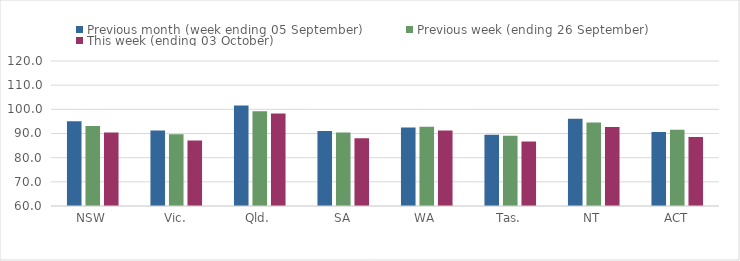
| Category | Previous month (week ending 05 September) | Previous week (ending 26 September) | This week (ending 03 October) |
|---|---|---|---|
| NSW | 95.12 | 93.07 | 90.46 |
| Vic. | 91.21 | 89.71 | 87.12 |
| Qld. | 101.62 | 99.2 | 98.28 |
| SA | 91.05 | 90.4 | 88.05 |
| WA | 92.48 | 92.83 | 91.22 |
| Tas. | 89.52 | 89.02 | 86.73 |
| NT | 96.14 | 94.59 | 92.66 |
| ACT | 90.61 | 91.55 | 88.59 |